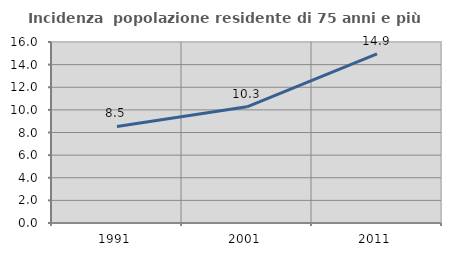
| Category | Incidenza  popolazione residente di 75 anni e più |
|---|---|
| 1991.0 | 8.531 |
| 2001.0 | 10.272 |
| 2011.0 | 14.945 |